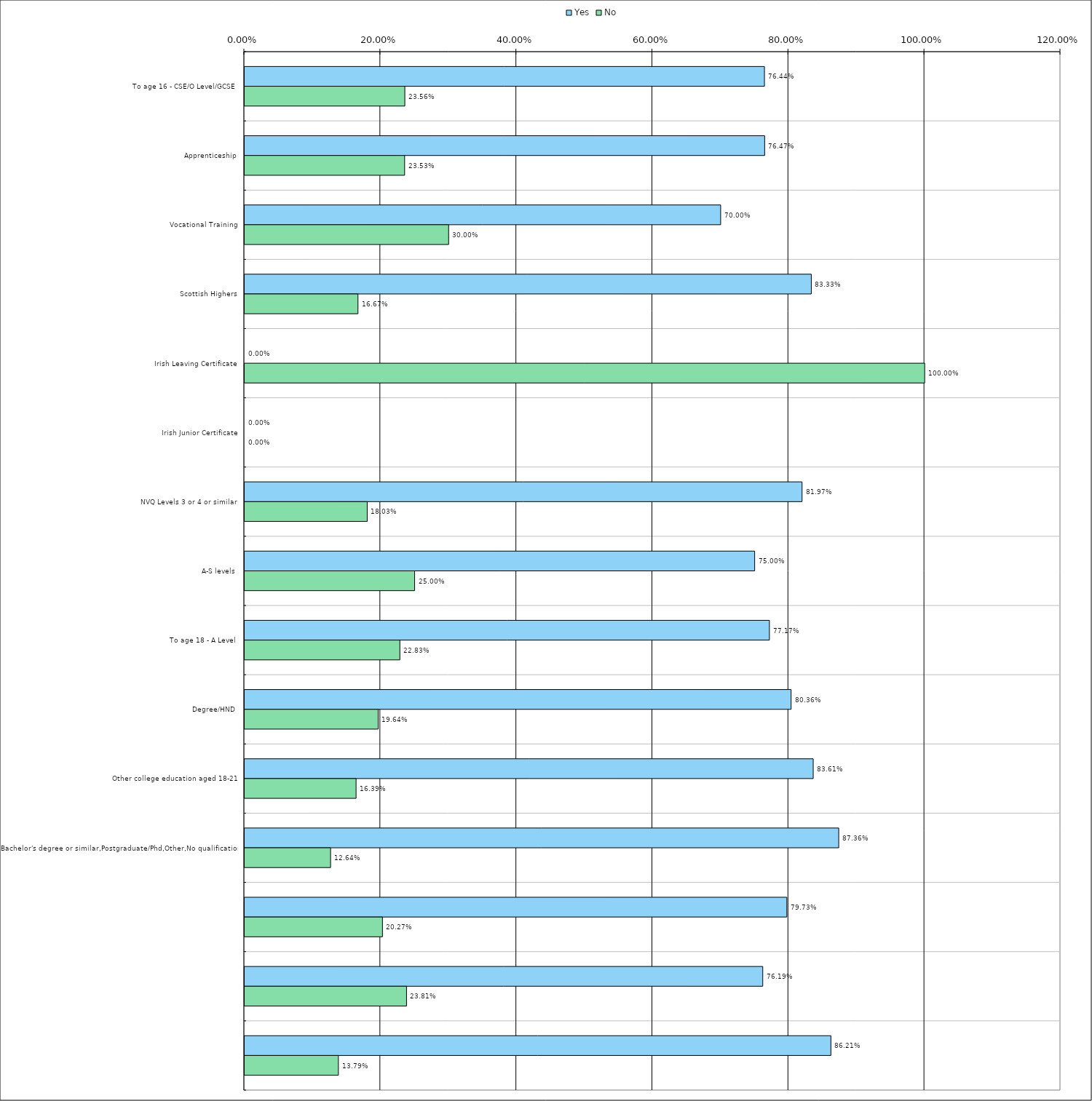
| Category | Yes | No |
|---|---|---|
| 0 | 0.764 | 0.236 |
| 1 | 0.765 | 0.235 |
| 2 | 0.7 | 0.3 |
| 3 | 0.833 | 0.167 |
| 4 | 0 | 1 |
| 5 | 0 | 0 |
| 6 | 0.82 | 0.18 |
| 7 | 0.75 | 0.25 |
| 8 | 0.772 | 0.228 |
| 9 | 0.804 | 0.196 |
| 10 | 0.836 | 0.164 |
| 11 | 0.874 | 0.126 |
| 12 | 0.797 | 0.203 |
| 13 | 0.762 | 0.238 |
| 14 | 0.862 | 0.138 |